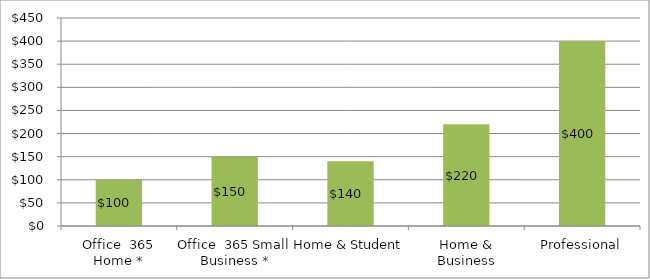
| Category | Series 0 |
|---|---|
| Office  365 Home * | 99.99 |
| Office  365 Small Business * | 150 |
| Home & Student | 139.99 |
| Home & Business | 219.99 |
| Professional | 399.99 |